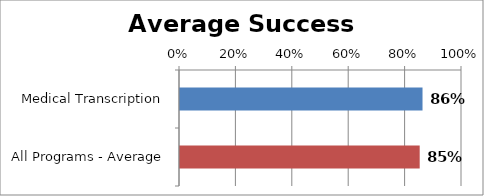
| Category | RetentionRate |
|---|---|
| Medical Transcription | 0.86 |
| All Programs - Average | 0.85 |